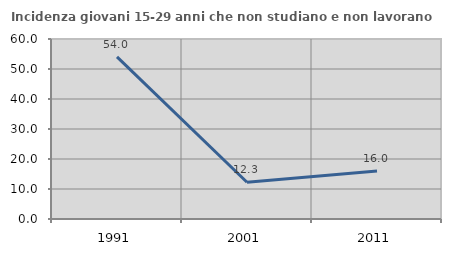
| Category | Incidenza giovani 15-29 anni che non studiano e non lavorano  |
|---|---|
| 1991.0 | 54.026 |
| 2001.0 | 12.258 |
| 2011.0 | 16 |